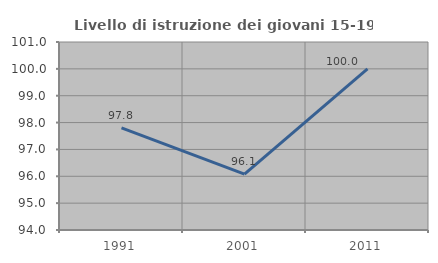
| Category | Livello di istruzione dei giovani 15-19 anni |
|---|---|
| 1991.0 | 97.802 |
| 2001.0 | 96.078 |
| 2011.0 | 100 |